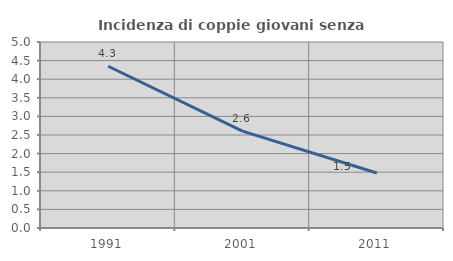
| Category | Incidenza di coppie giovani senza figli |
|---|---|
| 1991.0 | 4.348 |
| 2001.0 | 2.604 |
| 2011.0 | 1.478 |